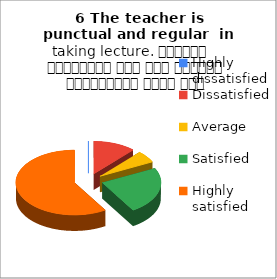
| Category | 6 The teacher is punctual and regular  in taking lecture. शिक्षक समयनिष्ठ हैं एवं नियमित व्याख्यान देते हैं |
|---|---|
| Highly dissatisfied | 0 |
| Dissatisfied | 2 |
| Average | 1 |
| Satisfied | 4 |
| Highly satisfied | 10 |